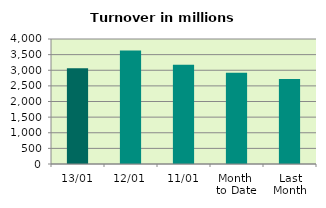
| Category | Series 0 |
|---|---|
| 13/01 | 3067.681 |
| 12/01 | 3633.043 |
| 11/01 | 3175.757 |
| Month 
to Date | 2916.502 |
| Last
Month | 2717.391 |